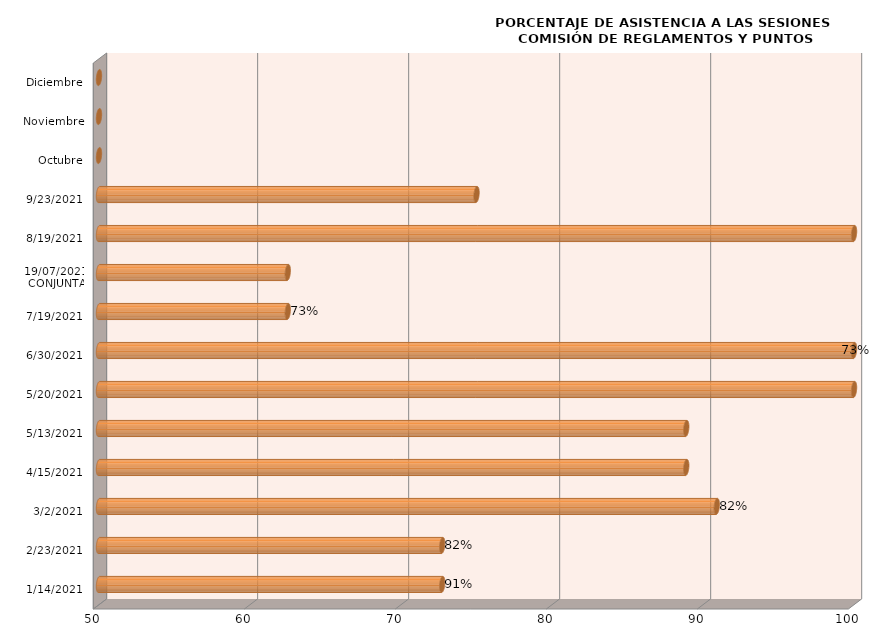
| Category | Series 0 |
|---|---|
| 14/01/2021 | 72.727 |
| 23/02/2021 | 72.727 |
| 02/03/2021 | 90.909 |
| 15/04/2021 | 88.889 |
| 13/05/2021 | 88.889 |
| 20/05/2021 | 100 |
| 30/06/2021 | 100 |
| 19/07/2021 | 62.5 |
| 19/07/2021
CONJUNTA | 62.5 |
| 19/08/2021 | 100 |
| 23/09/2021 | 75 |
| Octubre | 0 |
| Noviembre | 0 |
| Diciembre | 0 |